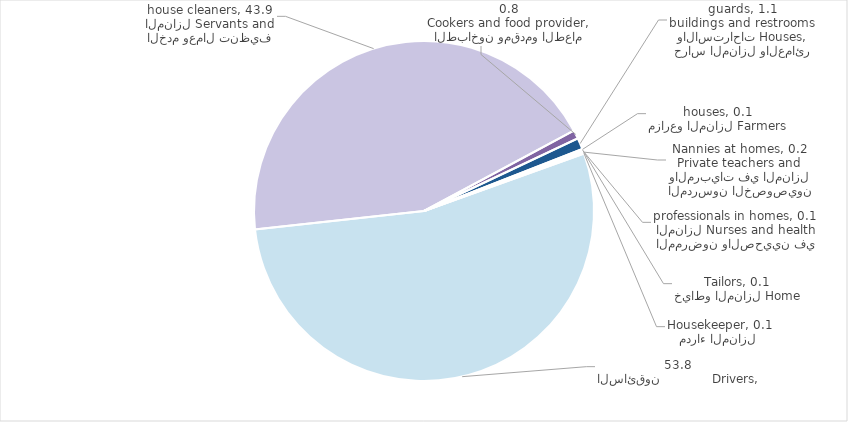
| Category | Series 0 |
|---|---|
| مدراء المنازل  Housekeeper | 0.073 |
| السائقون             Drivers | 53.753 |
| الخدم وعمال تنظيف المنازل Servants and house cleaners | 43.887 |
| الطباخون ومقدمو الطعام Cookers and food provider | 0.82 |
| حراس المنازل والعمائر والاستراحات Houses, buildings and restrooms guards | 1.077 |
| مزارعو المنازل Farmers houses | 0.092 |
| خياطو المنازل Home Tailors | 0.054 |
| الممرضون والصحيين في المنازل Nurses and health professionals in homes | 0.088 |
| المدرسون الخصوصيون والمربيات في المنازل Private teachers and Nannies at homes | 0.155 |